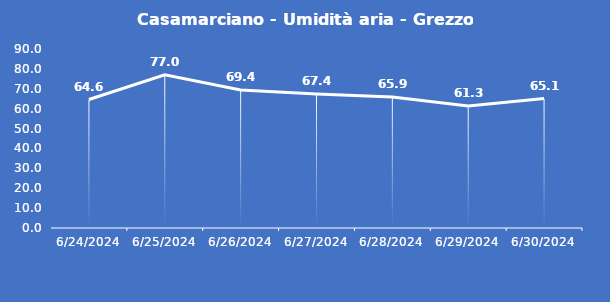
| Category | Casamarciano - Umidità aria - Grezzo (%) |
|---|---|
| 6/24/24 | 64.6 |
| 6/25/24 | 77 |
| 6/26/24 | 69.4 |
| 6/27/24 | 67.4 |
| 6/28/24 | 65.9 |
| 6/29/24 | 61.3 |
| 6/30/24 | 65.1 |